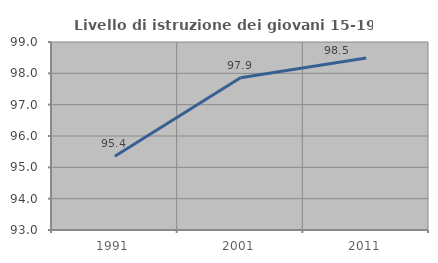
| Category | Livello di istruzione dei giovani 15-19 anni |
|---|---|
| 1991.0 | 95.352 |
| 2001.0 | 97.856 |
| 2011.0 | 98.489 |